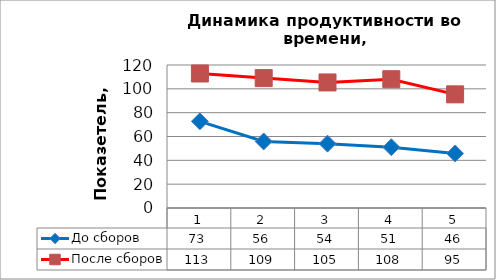
| Category | До сборов | После сборов |
|---|---|---|
| 0 | 72.727 | 112.87 |
| 1 | 55.833 | 109 |
| 2 | 54 | 105.367 |
| 3 | 51 | 108.079 |
| 4 | 45.773 | 95.37 |